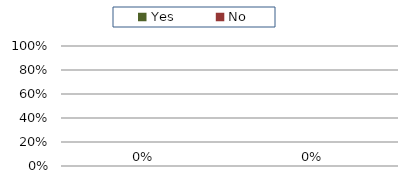
| Category | Total |
|---|---|
| Yes | 0 |
| No | 0 |